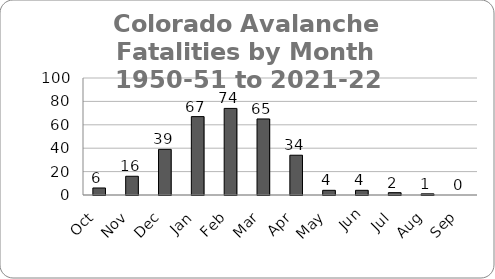
| Category | Series 0 |
|---|---|
| Oct | 6 |
| Nov | 16 |
| Dec | 39 |
| Jan | 67 |
| Feb | 74 |
| Mar | 65 |
| Apr | 34 |
| May | 4 |
| Jun | 4 |
| Jul | 2 |
| Aug | 1 |
| Sep | 0 |